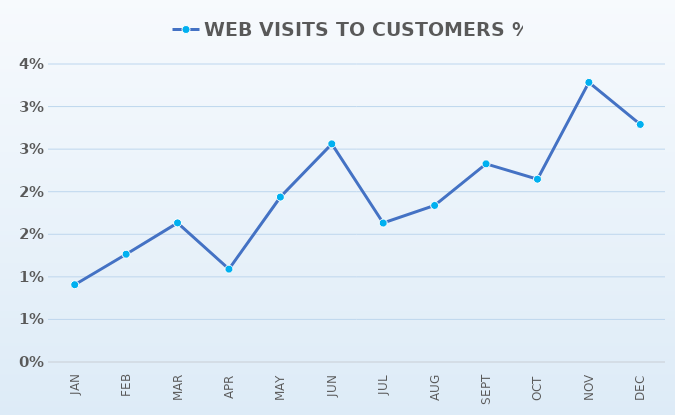
| Category | CONVERSION RATES | WEB VISITS TO CUSTOMERS % |
|---|---|---|
| JAN |  | 0.009 |
| FEB |  | 0.013 |
| MAR |  | 0.016 |
| APR |  | 0.011 |
| MAY |  | 0.019 |
| JUN |  | 0.026 |
| JUL |  | 0.016 |
| AUG |  | 0.018 |
| SEPT |  | 0.023 |
| OCT |  | 0.021 |
| NOV |  | 0.033 |
| DEC |  | 0.028 |